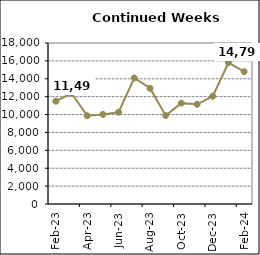
| Category | Series 0 |
|---|---|
| 2023-02-01 | 11490 |
| 2023-03-01 | 12383 |
| 2023-04-01 | 9869 |
| 2023-05-01 | 10014 |
| 2023-06-01 | 10266 |
| 2023-07-01 | 14088 |
| 2023-08-01 | 12937 |
| 2023-09-01 | 9899 |
| 2023-10-01 | 11277 |
| 2023-11-01 | 11150 |
| 2023-12-01 | 12049 |
| 2024-01-01 | 15796 |
| 2024-02-01 | 14798 |